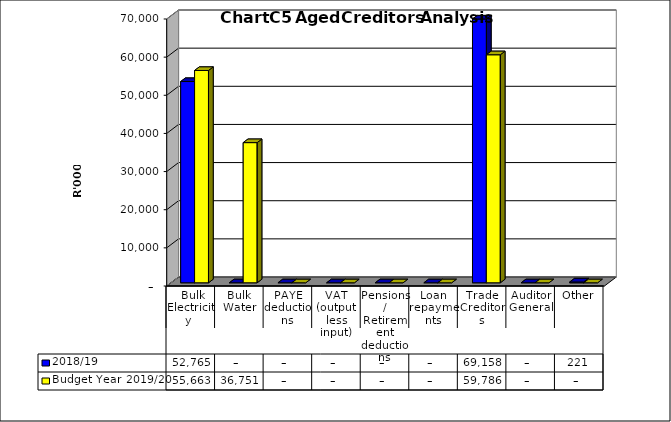
| Category | 2018/19 | Budget Year 2019/20 |
|---|---|---|
|  Bulk Electricity  | 52765143.77 | 55663321.7 |
| Bulk Water | 0 | 36751040.03 |
| PAYE deductions | 0 | 0 |
| VAT (output less input) | 0 | 0 |
| Pensions / Retirement deductions | 0 | 0 |
| Loan repayments | 0 | 0 |
| Trade Creditors | 69157841 | 59785860.39 |
| Auditor General | 0 | 0 |
| Other | 221278 | 0 |